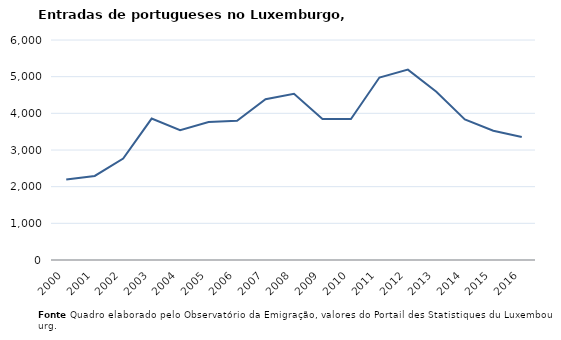
| Category | Entradas |
|---|---|
| 2000.0 | 2193 |
| 2001.0 | 2293 |
| 2002.0 | 2767 |
| 2003.0 | 3857 |
| 2004.0 | 3542 |
| 2005.0 | 3761 |
| 2006.0 | 3796 |
| 2007.0 | 4385 |
| 2008.0 | 4531 |
| 2009.0 | 3844 |
| 2010.0 | 3845 |
| 2011.0 | 4977 |
| 2012.0 | 5193 |
| 2013.0 | 4590 |
| 2014.0 | 3832 |
| 2015.0 | 3525 |
| 2016.0 | 3355 |